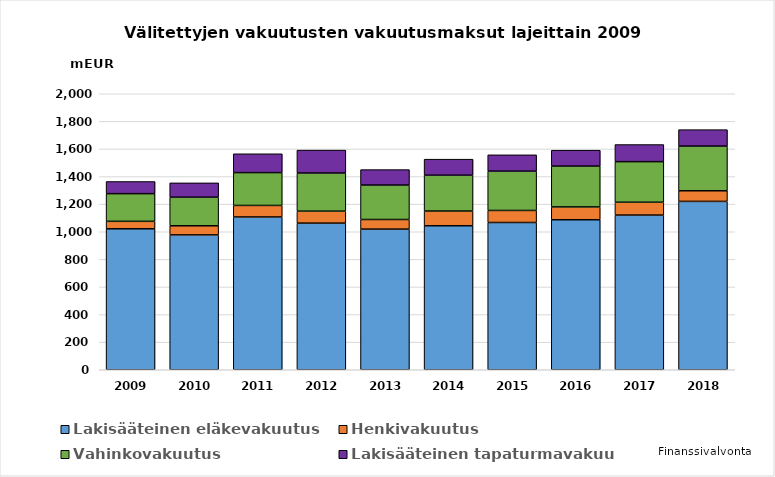
| Category | Lakisääteinen eläkevakuutus | Henkivakuutus | Vahinkovakuutus | Lakisääteinen tapaturmavakuutus |
|---|---|---|---|---|
| 2009.0 | 1021.457 | 54.107 | 200.56 | 88.041 |
| 2010.0 | 977.321 | 65.95 | 207.341 | 103.558 |
| 2011.0 | 1107.329 | 83.403 | 238.041 | 136.289 |
| 2012.0 | 1062.705 | 86.597 | 276.62 | 165.706 |
| 2013.0 | 1019.216 | 69.648 | 249.823 | 111.515 |
| 2014.0 | 1043.573 | 106.619 | 259.835 | 115.957 |
| 2015.0 | 1067.062 | 87.285 | 284.943 | 118.153 |
| 2016.0 | 1087 | 93 | 296 | 115 |
| 2017.0 | 1121 | 93 | 294 | 124 |
| 2018.0 | 1220 | 77 | 324 | 119 |